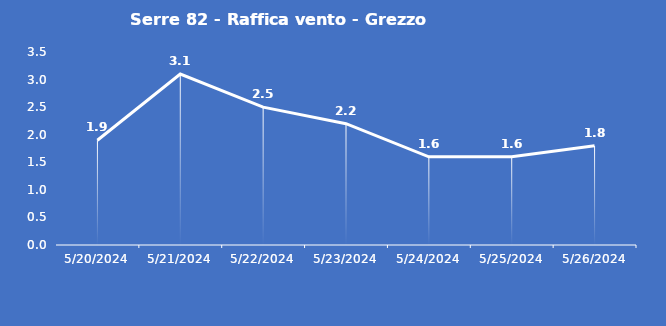
| Category | Serre 82 - Raffica vento - Grezzo (m/s) |
|---|---|
| 5/20/24 | 1.9 |
| 5/21/24 | 3.1 |
| 5/22/24 | 2.5 |
| 5/23/24 | 2.2 |
| 5/24/24 | 1.6 |
| 5/25/24 | 1.6 |
| 5/26/24 | 1.8 |